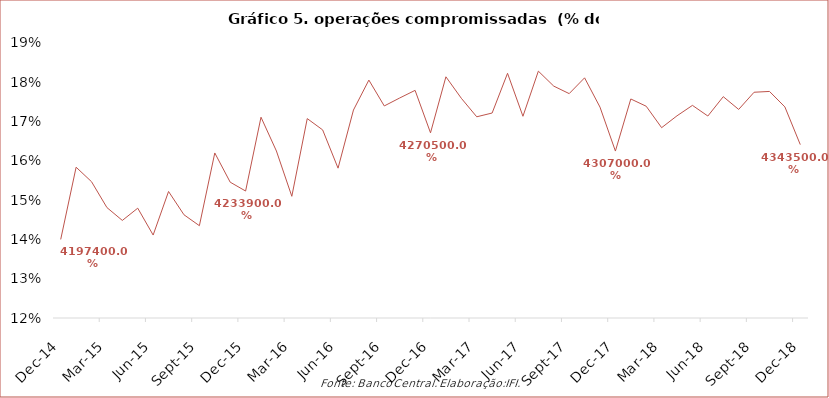
| Category | Operações compromissadas do BC |
|---|---|
| 2014-12-01 | 0.14 |
| 2015-01-01 | 0.158 |
| 2015-02-01 | 0.155 |
| 2015-03-01 | 0.148 |
| 2015-04-01 | 0.145 |
| 2015-05-01 | 0.148 |
| 2015-06-01 | 0.141 |
| 2015-07-01 | 0.152 |
| 2015-08-01 | 0.146 |
| 2015-09-01 | 0.143 |
| 2015-10-01 | 0.162 |
| 2015-11-01 | 0.155 |
| 2015-12-01 | 0.152 |
| 2016-01-01 | 0.171 |
| 2016-02-01 | 0.163 |
| 2016-03-01 | 0.151 |
| 2016-04-01 | 0.171 |
| 2016-05-01 | 0.168 |
| 2016-06-01 | 0.158 |
| 2016-07-01 | 0.173 |
| 2016-08-01 | 0.181 |
| 2016-09-01 | 0.174 |
| 2016-10-01 | 0.176 |
| 2016-11-01 | 0.178 |
| 2016-12-01 | 0.167 |
| 2017-01-01 | 0.181 |
| 2017-02-01 | 0.176 |
| 2017-03-01 | 0.171 |
| 2017-04-01 | 0.172 |
| 2017-05-01 | 0.182 |
| 2017-06-01 | 0.171 |
| 2017-07-01 | 0.183 |
| 2017-08-01 | 0.179 |
| 2017-09-01 | 0.177 |
| 2017-10-01 | 0.181 |
| 2017-11-01 | 0.174 |
| 2017-12-01 | 0.162 |
| 2018-01-01 | 0.176 |
| 2018-02-01 | 0.174 |
| 2018-03-01 | 0.168 |
| 2018-04-01 | 0.171 |
| 2018-05-01 | 0.174 |
| 2018-06-01 | 0.171 |
| 2018-07-01 | 0.176 |
| 2018-08-01 | 0.173 |
| 2018-09-01 | 0.177 |
| 2018-10-01 | 0.178 |
| 2018-11-01 | 0.174 |
| 2018-12-01 | 0.164 |